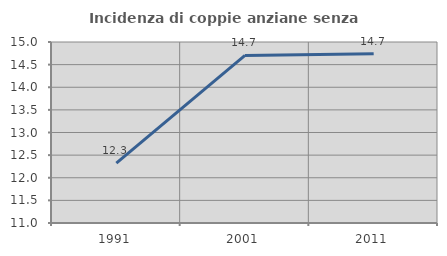
| Category | Incidenza di coppie anziane senza figli  |
|---|---|
| 1991.0 | 12.322 |
| 2001.0 | 14.703 |
| 2011.0 | 14.738 |